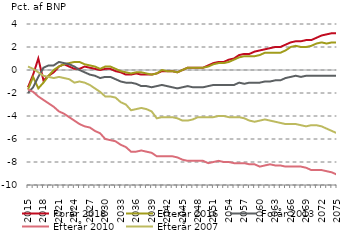
| Category | nul-linje | Forår 2018 | Efterår 2016 | Forår 2013  | Efterår 2010 | Efterår 2007 |
|---|---|---|---|---|---|---|
| 2015.0 | 0 | -1.5 | -1.7 | -2 | -1.7 | 0.3 |
| 2016.0 | 0 | -0.4 | -0.6 | -1.5 | -1.9 | 0.1 |
| 2017.0 | 0 | 1 | -1.6 | -0.6 | -2.3 | -0.2 |
| 2018.0 | 0 | -0.9 | -1.1 | 0.2 | -2.6 | -0.5 |
| 2019.0 | 0 | -0.5 | -0.5 | 0.4 | -2.9 | -0.6 |
| 2020.0 | 0 | -0.2 | 0 | 0.4 | -3.2 | -0.7 |
| 2021.0 | 0 | 0.3 | 0.3 | 0.7 | -3.6 | -0.6 |
| 2022.0 | 0 | 0.5 | 0.5 | 0.6 | -3.8 | -0.7 |
| 2023.0 | 0 | 0.3 | 0.6 | 0.5 | -4.1 | -0.8 |
| 2024.0 | 0 | 0.1 | 0.7 | 0.3 | -4.4 | -1.1 |
| 2025.0 | 0 | 0.1 | 0.7 | 0 | -4.7 | -1 |
| 2026.0 | 0 | 0.3 | 0.5 | -0.2 | -4.9 | -1.1 |
| 2027.0 | 0 | 0.2 | 0.4 | -0.4 | -5 | -1.3 |
| 2028.0 | 0 | 0.1 | 0.3 | -0.5 | -5.3 | -1.6 |
| 2029.0 | 0 | 0 | 0.1 | -0.7 | -5.5 | -1.9 |
| 2030.0 | 0 | 0.1 | 0.3 | -0.6 | -6 | -2.3 |
| 2031.0 | 0 | 0.1 | 0.3 | -0.6 | -6.1 | -2.3 |
| 2032.0 | 0 | -0.1 | 0.1 | -0.8 | -6.2 | -2.4 |
| 2033.0 | 0 | -0.2 | -0.1 | -1 | -6.5 | -2.8 |
| 2034.0 | 0 | -0.4 | -0.2 | -1.1 | -6.7 | -3 |
| 2035.0 | 0 | -0.4 | -0.3 | -1.1 | -7.1 | -3.5 |
| 2036.0 | 0 | -0.3 | -0.2 | -1.2 | -7.1 | -3.4 |
| 2037.0 | 0 | -0.4 | -0.2 | -1.4 | -7 | -3.3 |
| 2038.0 | 0 | -0.4 | -0.3 | -1.4 | -7.1 | -3.4 |
| 2039.0 | 0 | -0.4 | -0.4 | -1.5 | -7.2 | -3.6 |
| 2040.0 | 0 | -0.3 | -0.3 | -1.4 | -7.5 | -4.2 |
| 2041.0 | 0 | -0.1 | 0 | -1.3 | -7.5 | -4.1 |
| 2042.0 | 0 | -0.1 | -0.1 | -1.4 | -7.5 | -4.1 |
| 2043.0 | 0 | -0.1 | -0.1 | -1.5 | -7.5 | -4.1 |
| 2044.0 | 0 | -0.2 | -0.2 | -1.6 | -7.6 | -4.2 |
| 2045.0 | 0 | 0 | 0 | -1.5 | -7.8 | -4.4 |
| 2046.0 | 0 | 0.2 | 0.2 | -1.4 | -7.9 | -4.4 |
| 2047.0 | 0 | 0.2 | 0.2 | -1.5 | -7.9 | -4.3 |
| 2048.0 | 0 | 0.2 | 0.2 | -1.5 | -7.9 | -4.1 |
| 2049.0 | 0 | 0.2 | 0.2 | -1.5 | -7.9 | -4.1 |
| 2050.0 | 0 | 0.4 | 0.3 | -1.4 | -8.1 | -4.1 |
| 2051.0 | 0 | 0.6 | 0.5 | -1.3 | -8 | -4.1 |
| 2052.0 | 0 | 0.7 | 0.6 | -1.3 | -7.9 | -4 |
| 2053.0 | 0 | 0.7 | 0.6 | -1.3 | -8 | -4 |
| 2054.0 | 0 | 0.9 | 0.7 | -1.3 | -8 | -4.1 |
| 2055.0 | 0 | 1 | 0.9 | -1.3 | -8.1 | -4.1 |
| 2056.0 | 0 | 1.3 | 1.1 | -1.1 | -8.1 | -4.1 |
| 2057.0 | 0 | 1.4 | 1.2 | -1.2 | -8.1 | -4.2 |
| 2058.0 | 0 | 1.4 | 1.2 | -1.1 | -8.2 | -4.4 |
| 2059.0 | 0 | 1.6 | 1.2 | -1.1 | -8.2 | -4.5 |
| 2060.0 | 0 | 1.7 | 1.3 | -1.1 | -8.4 | -4.4 |
| 2061.0 | 0 | 1.8 | 1.5 | -1 | -8.3 | -4.3 |
| 2062.0 | 0 | 1.9 | 1.5 | -1 | -8.2 | -4.4 |
| 2063.0 | 0 | 2 | 1.5 | -0.9 | -8.3 | -4.5 |
| 2064.0 | 0 | 2 | 1.5 | -0.9 | -8.3 | -4.6 |
| 2065.0 | 0 | 2.2 | 1.7 | -0.7 | -8.4 | -4.7 |
| 2066.0 | 0 | 2.4 | 2 | -0.6 | -8.4 | -4.7 |
| 2067.0 | 0 | 2.5 | 2.1 | -0.5 | -8.4 | -4.7 |
| 2068.0 | 0 | 2.5 | 2 | -0.6 | -8.4 | -4.8 |
| 2069.0 | 0 | 2.6 | 2 | -0.5 | -8.5 | -4.9 |
| 2070.0 | 0 | 2.6 | 2.1 | -0.5 | -8.7 | -4.8 |
| 2071.0 | 0 | 2.8 | 2.3 | -0.5 | -8.7 | -4.8 |
| 2072.0 | 0 | 3 | 2.4 | -0.5 | -8.7 | -4.9 |
| 2073.0 | 0 | 3.1 | 2.3 | -0.5 | -8.8 | -5.1 |
| 2074.0 | 0 | 3.2 | 2.4 | -0.5 | -8.9 | -5.3 |
| 2075.0 | 0 | 3.2 | 2.4 | -0.5 | -9.1 | -5.5 |